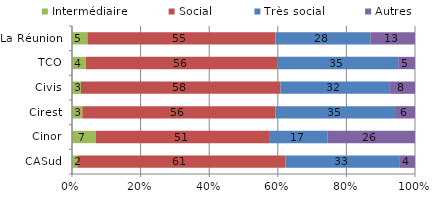
| Category | Intermédiaire | Social | Très social | Autres |
|---|---|---|---|---|
| CASud | 1.564 | 60.691 | 33.339 | 4.406 |
| Cinor | 6.949 | 50.74 | 16.759 | 25.552 |
| Cirest | 3.01 | 56.303 | 35.139 | 5.548 |
| Civis | 2.614 | 58.171 | 31.686 | 7.529 |
| TCO | 4.022 | 55.901 | 35.167 | 4.91 |
| La Réunion | 4.507 | 54.828 | 27.634 | 13.031 |